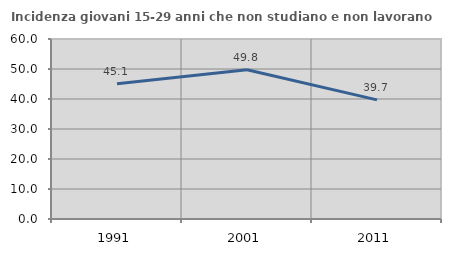
| Category | Incidenza giovani 15-29 anni che non studiano e non lavorano  |
|---|---|
| 1991.0 | 45.085 |
| 2001.0 | 49.77 |
| 2011.0 | 39.715 |